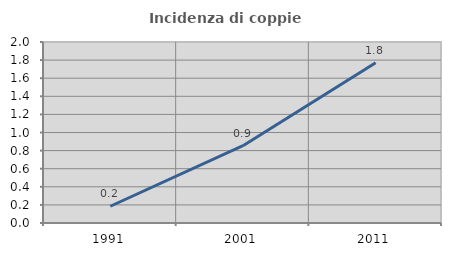
| Category | Incidenza di coppie miste |
|---|---|
| 1991.0 | 0.185 |
| 2001.0 | 0.854 |
| 2011.0 | 1.771 |